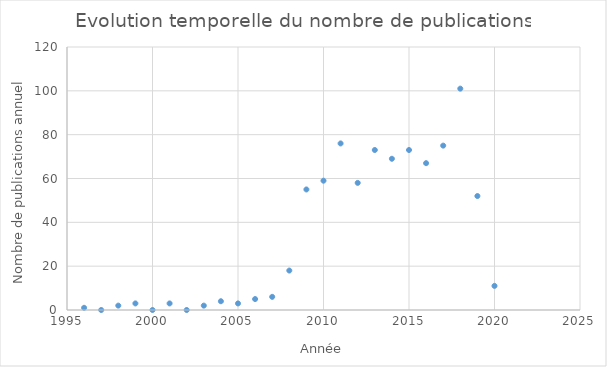
| Category | Series 0 |
|---|---|
| 1996.0 | 1 |
| 1997.0 | 0 |
| 1998.0 | 2 |
| 1999.0 | 3 |
| 2000.0 | 0 |
| 2001.0 | 3 |
| 2002.0 | 0 |
| 2003.0 | 2 |
| 2004.0 | 4 |
| 2005.0 | 3 |
| 2006.0 | 5 |
| 2007.0 | 6 |
| 2008.0 | 18 |
| 2009.0 | 55 |
| 2010.0 | 59 |
| 2011.0 | 76 |
| 2012.0 | 58 |
| 2013.0 | 73 |
| 2014.0 | 69 |
| 2015.0 | 73 |
| 2016.0 | 67 |
| 2017.0 | 75 |
| 2018.0 | 101 |
| 2019.0 | 52 |
| 2020.0 | 11 |